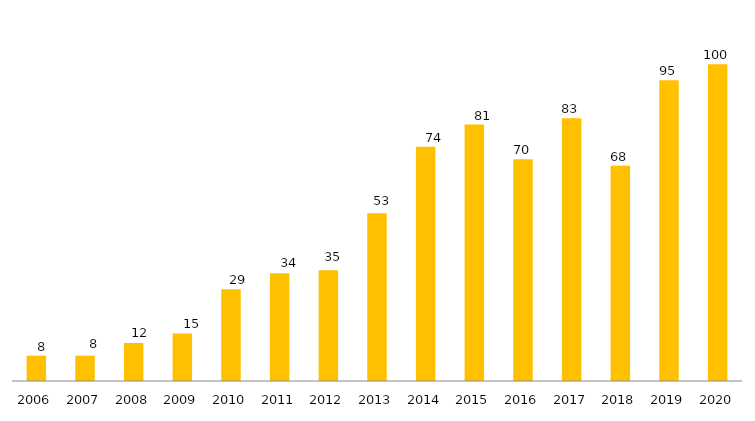
| Category | Programa |
|---|---|
| 2006.0 | 8 |
| 2007.0 | 8 |
| 2008.0 | 12 |
| 2009.0 | 15 |
| 2010.0 | 29 |
| 2011.0 | 34 |
| 2012.0 | 35 |
| 2013.0 | 53 |
| 2014.0 | 74 |
| 2015.0 | 81 |
| 2016.0 | 70 |
| 2017.0 | 83 |
| 2018.0 | 68 |
| 2019.0 | 95 |
| 2020.0 | 100 |